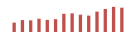
| Category | Importações (2) |
|---|---|
| 0 | 62681.056 |
| 1 | 79621.593 |
| 2 | 77709.867 |
| 3 | 88593.929 |
| 4 | 80744.22 |
| 5 | 85348.563 |
| 6 | 121368.935 |
| 7 | 124143.971 |
| 8 | 115571.707 |
| 9 | 109068.986 |
| 10 | 136178.726 |
| 11 | 153404.387 |
| 12 | 167744.463 |
| 13 | 162100.754 |